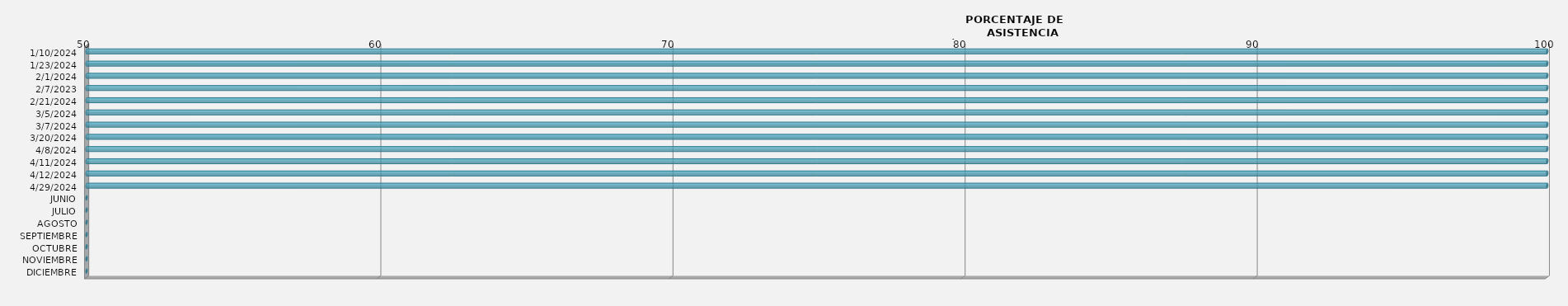
| Category | 10/01/2024 |
|---|---|
| 10/01/2024 | 100 |
| 23/01/2024 | 100 |
| 01/02/2024 | 100 |
| 07/02/2023 | 100 |
| 21/02/2024 | 100 |
| 05/03/2024 | 100 |
| 07/03/2024 | 100 |
| 20/03/2024 | 100 |
| 08/04/2024 | 100 |
| 11/04/2024 | 100 |
| 12/04/2024 | 100 |
| 29/04/2024 | 100 |
| JUNIO | 0 |
| JULIO | 0 |
| AGOSTO | 0 |
| SEPTIEMBRE | 0 |
| OCTUBRE | 0 |
| NOVIEMBRE | 0 |
| DICIEMBRE | 0 |